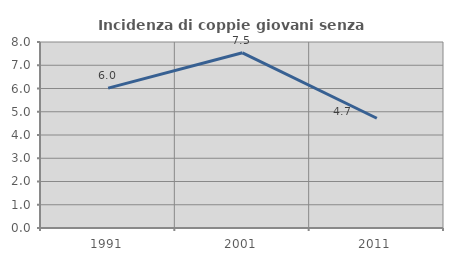
| Category | Incidenza di coppie giovani senza figli |
|---|---|
| 1991.0 | 6.015 |
| 2001.0 | 7.535 |
| 2011.0 | 4.721 |